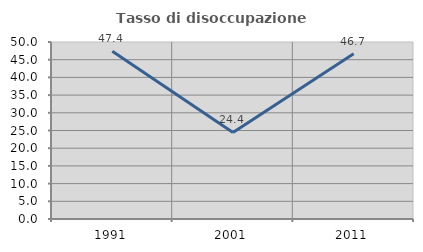
| Category | Tasso di disoccupazione giovanile  |
|---|---|
| 1991.0 | 47.368 |
| 2001.0 | 24.444 |
| 2011.0 | 46.667 |